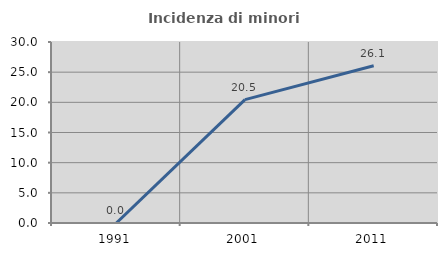
| Category | Incidenza di minori stranieri |
|---|---|
| 1991.0 | 0 |
| 2001.0 | 20.455 |
| 2011.0 | 26.055 |